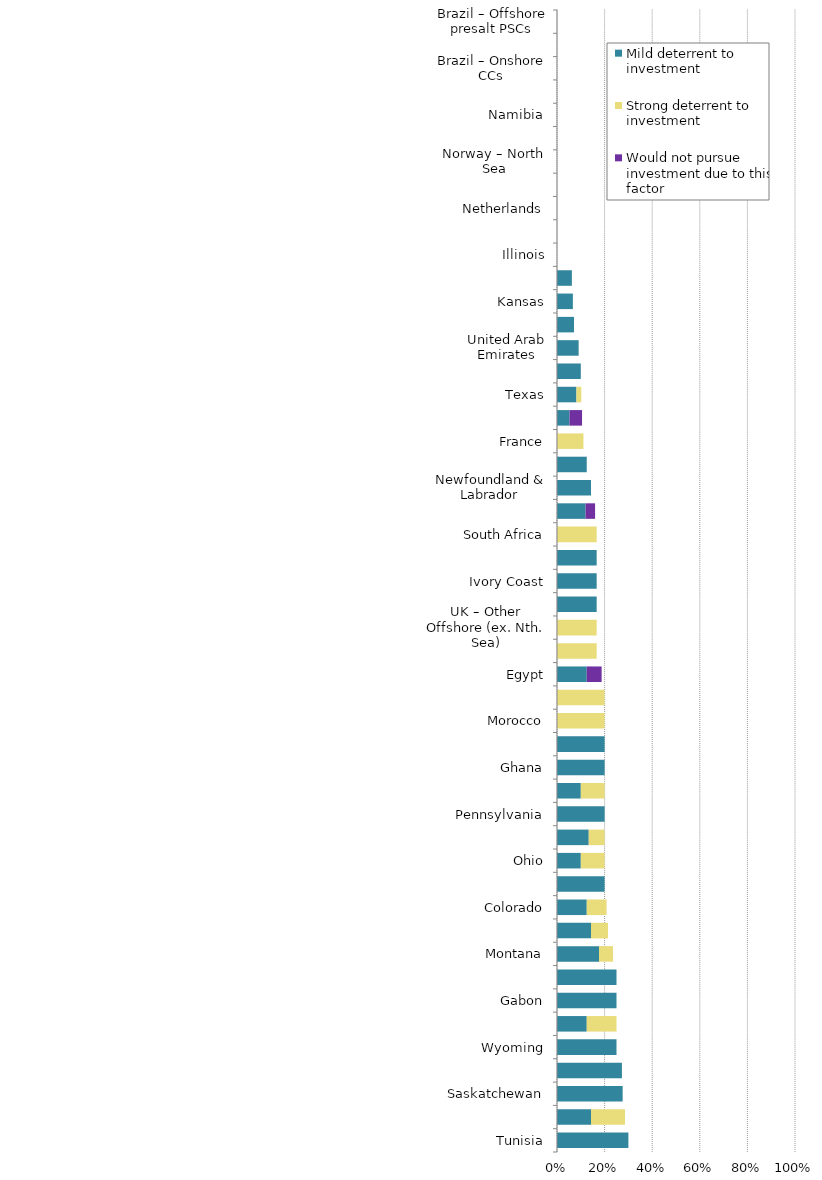
| Category | Mild deterrent to investment | Strong deterrent to investment | Would not pursue investment due to this factor |
|---|---|---|---|
| Tunisia | 0.3 | 0 | 0 |
| Guyana | 0.143 | 0.143 | 0 |
| Saskatchewan | 0.276 | 0 | 0 |
| Algeria | 0.273 | 0 | 0 |
| Wyoming | 0.25 | 0 | 0 |
| Brunei | 0.125 | 0.125 | 0 |
| Gabon | 0.25 | 0 | 0 |
| Mozambique | 0.25 | 0 | 0 |
| Montana | 0.176 | 0.059 | 0 |
| Manitoba | 0.143 | 0.071 | 0 |
| Colorado | 0.125 | 0.083 | 0 |
| Arkansas | 0.2 | 0 | 0 |
| Ohio | 0.1 | 0.1 | 0 |
| Oklahoma | 0.133 | 0.067 | 0 |
| Pennsylvania | 0.2 | 0 | 0 |
| Spain – Onshore | 0.1 | 0.1 | 0 |
| Ghana | 0.2 | 0 | 0 |
| Uganda | 0.2 | 0 | 0 |
| Morocco | 0 | 0.2 | 0 |
| Yemen | 0 | 0.2 | 0 |
| Egypt | 0.125 | 0 | 0.062 |
| Spain – Offshore | 0 | 0.167 | 0 |
| UK – Other Offshore (ex. Nth. Sea) | 0 | 0.167 | 0 |
| Angola | 0.167 | 0 | 0 |
| Ivory Coast | 0.167 | 0 | 0 |
| Rep. of Congo (Brazzaville) | 0.167 | 0 | 0 |
| South Africa | 0 | 0.167 | 0 |
| North Dakota | 0.12 | 0 | 0.04 |
| Newfoundland & Labrador | 0.143 | 0 | 0 |
| Alabama | 0.125 | 0 | 0 |
| France | 0 | 0.111 | 0 |
| US Offshore – Gulf of Mexico | 0.053 | 0 | 0.053 |
| Texas | 0.082 | 0.02 | 0 |
| Equatorial Guinea | 0.1 | 0 | 0 |
| United Arab Emirates | 0.091 | 0 | 0 |
| Mississippi | 0.071 | 0 | 0 |
| Kansas | 0.067 | 0 | 0 |
| Australia – Offshore | 0.062 | 0 | 0 |
| Illinois | 0 | 0 | 0 |
| Ireland | 0 | 0 | 0 |
| Netherlands | 0 | 0 | 0 |
| Norway – Other Offshore (ex. Nth. Sea) | 0 | 0 | 0 |
| Norway – North Sea | 0 | 0 | 0 |
| United Kingdom – North Sea | 0 | 0 | 0 |
| Namibia | 0 | 0 | 0 |
| Kuwait | 0 | 0 | 0 |
| Brazil – Onshore CCs | 0 | 0 | 0 |
| Brazil – Offshore CCs | 0 | 0 | 0 |
| Brazil – Offshore presalt PSCs | 0 | 0 | 0 |